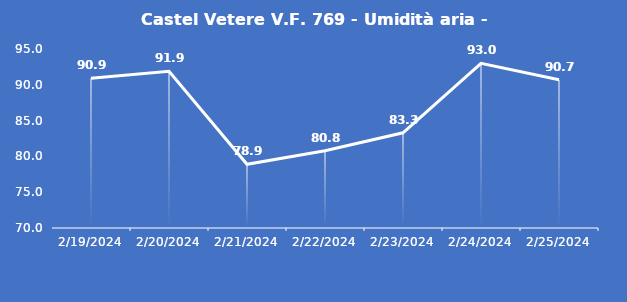
| Category | Castel Vetere V.F. 769 - Umidità aria - Grezzo (%) |
|---|---|
| 2/19/24 | 90.9 |
| 2/20/24 | 91.9 |
| 2/21/24 | 78.9 |
| 2/22/24 | 80.8 |
| 2/23/24 | 83.3 |
| 2/24/24 | 93 |
| 2/25/24 | 90.7 |